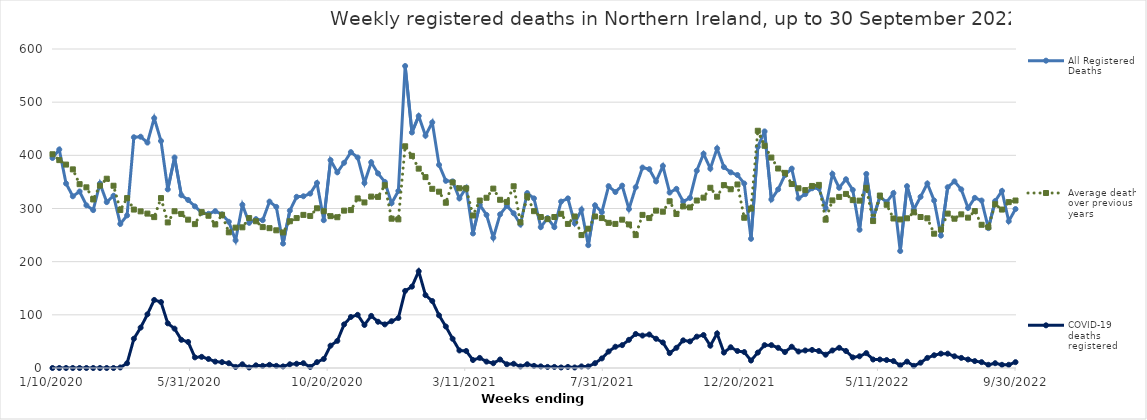
| Category | All Registered Deaths | Average deaths over previous 5 years | COVID-19 deaths registered |
|---|---|---|---|
| 1/10/20 | 395 | 402 | 0 |
| 1/17/20 | 411 | 391 | 0 |
| 1/24/20 | 347 | 382.6 | 0 |
| 1/31/20 | 323 | 373.6 | 0 |
| 2/7/20 | 332 | 345.8 | 0 |
| 2/14/20 | 306 | 339.8 | 0 |
| 2/21/20 | 297 | 317 | 0 |
| 2/28/20 | 347 | 343 | 0 |
| 3/6/20 | 312 | 356 | 0 |
| 3/13/20 | 324 | 342.8 | 0 |
| 3/20/20 | 271 | 297.2 | 1 |
| 3/27/20 | 287 | 319.6 | 9 |
| 4/3/20 | 434 | 298 | 55 |
| 4/10/20 | 435 | 294.6 | 76 |
| 4/17/20 | 424 | 290.4 | 101 |
| 4/24/20 | 470 | 283.8 | 128 |
| 5/1/20 | 427 | 319.6 | 124 |
| 5/8/20 | 336 | 273.8 | 84 |
| 5/15/20 | 396 | 294.8 | 74 |
| 5/22/20 | 325 | 289.8 | 53 |
| 5/29/20 | 316 | 279 | 49 |
| 6/5/20 | 304 | 270.6 | 20 |
| 6/12/20 | 292 | 293.2 | 21 |
| 6/19/20 | 290 | 286.4 | 17 |
| 6/26/20 | 295 | 270 | 12 |
| 7/3/20 | 289 | 288.2 | 11 |
| 7/10/20 | 275 | 255.2 | 9 |
| 7/17/20 | 240 | 264 | 2 |
| 7/24/20 | 307 | 264.6 | 7 |
| 7/31/20 | 273 | 282 | 1 |
| 8/7/20 | 280 | 276 | 5 |
| 8/14/20 | 278 | 265 | 4 |
| 8/21/20 | 313 | 263 | 6 |
| 8/28/20 | 303 | 259 | 4 |
| 9/4/20 | 234 | 255 | 3 |
| 9/11/20 | 296 | 276 | 7 |
| 9/18/20 | 322 | 282 | 8 |
| 9/25/20 | 323 | 288 | 9 |
| 10/2/20 | 328 | 286 | 2 |
| 10/9/20 | 348 | 300.4 | 11 |
| 10/16/20 | 278 | 294.8 | 17 |
| 10/23/20 | 391 | 285.6 | 42 |
| 10/30/20 | 368 | 283.6 | 51 |
| 11/6/20 | 386 | 296 | 82 |
| 11/13/20 | 406 | 297 | 96 |
| 11/20/20 | 396 | 319 | 100 |
| 11/27/20 | 348 | 311.4 | 81 |
| 12/4/20 | 387 | 322.4 | 98 |
| 12/11/20 | 366 | 321.8 | 87 |
| 12/18/20 | 350 | 343.8 | 82 |
| 12/25/20 | 310 | 280.8 | 88 |
| 1/1/21 | 333 | 279.6 | 94 |
| 1/8/21 | 568 | 417 | 145 |
| 1/15/21 | 443 | 399 | 153 |
| 1/22/21 | 474 | 375 | 182 |
| 1/29/21 | 437 | 359 | 137 |
| 2/5/21 | 462 | 337 | 126 |
| 2/12/21 | 382 | 331.6 | 99 |
| 2/19/21 | 352 | 310.8 | 78 |
| 2/26/21 | 351 | 349 | 55 |
| 3/5/21 | 319 | 338 | 33 |
| 3/12/21 | 339 | 338 | 32 |
| 3/19/21 | 253 | 286.8 | 15 |
| 3/26/21 | 307 | 315 | 19 |
| 4/2/21 | 288 | 320.2 | 12 |
| 4/9/21 | 245 | 337.4 | 9 |
| 4/16/21 | 289 | 316.4 | 16 |
| 4/23/21 | 305 | 312.4 | 7 |
| 4/30/21 | 291 | 341.8 | 8 |
| 5/7/21 | 270 | 274 | 3 |
| 5/14/21 | 329 | 323 | 7 |
| 5/21/21 | 319 | 295 | 4 |
| 5/28/21 | 265 | 284 | 3 |
| 6/4/21 | 282 | 280 | 2 |
| 6/11/21 | 265 | 284 | 2 |
| 6/18/21 | 313 | 290 | 1 |
| 6/25/21 | 319 | 271 | 2 |
| 7/2/21 | 272 | 285 | 1 |
| 7/9/21 | 298 | 250 | 3 |
| 7/16/21 | 231 | 262 | 3 |
| 7/23/21 | 306 | 285 | 9 |
| 7/30/21 | 293 | 282 | 18 |
| 8/6/21 | 342 | 273 | 31 |
| 8/13/21 | 331 | 271 | 40 |
| 8/20/21 | 343 | 279 | 43 |
| 8/27/21 | 299 | 270 | 53 |
| 9/3/21 | 340 | 250 | 64 |
| 9/10/21 | 377 | 288 | 61 |
| 9/17/21 | 374 | 282 | 63 |
| 9/24/21 | 351 | 296 | 55 |
| 10/1/21 | 380 | 294 | 48 |
| 10/8/21 | 330 | 313.6 | 28 |
| 10/15/21 | 337 | 289.6 | 38 |
| 10/22/21 | 313 | 304 | 52 |
| 10/29/21 | 320 | 302 | 50 |
| 11/5/21 | 371 | 315 | 59 |
| 11/12/21 | 403 | 320.4 | 62 |
| 11/19/21 | 375 | 339 | 42 |
| 11/26/21 | 413 | 322.2 | 65 |
| 12/3/21 | 378 | 344 | 29 |
| 12/10/21 | 368 | 336.2 | 39 |
| 12/17/21 | 363 | 345.2 | 32 |
| 12/24/21 | 347 | 282.6 | 30 |
| 12/31/21 | 243 | 299.8 | 14 |
| 1/7/22 | 416 | 446.2 | 29 |
| 1/14/22 | 445 | 418 | 43 |
| 1/21/22 | 317 | 395.8 | 43 |
| 1/28/22 | 336 | 375.2 | 38 |
| 2/4/22 | 363 | 367 | 30 |
| 2/11/22 | 375 | 346 | 40 |
| 2/18/22 | 319 | 338 | 31 |
| 2/25/22 | 327 | 334.6 | 33 |
| 3/4/22 | 338 | 342.4 | 34 |
| 3/11/22 | 338 | 344.4 | 32 |
| 3/18/22 | 301 | 279 | 25 |
| 3/25/22 | 365 | 315.2 | 33 |
| 4/1/22 | 339 | 321.8 | 38 |
| 4/8/22 | 355 | 327.4 | 32 |
| 4/15/22 | 335 | 315.8 | 20 |
| 4/22/22 | 260 | 314.8 | 22 |
| 4/29/22 | 365 | 338.8 | 28 |
| 5/6/22 | 281 | 276.4 | 16 |
| 5/13/22 | 322 | 324.4 | 16 |
| 5/20/22 | 312 | 307 | 15 |
| 5/27/22 | 329 | 281.2 | 13 |
| 6/3/22 | 220 | 279.4 | 5 |
| 6/10/22 | 342 | 281.6 | 12 |
| 6/17/22 | 298 | 292.8 | 4 |
| 6/24/22 | 322 | 284 | 10 |
| 7/1/22 | 347 | 281.6 | 19 |
| 7/8/22 | 315 | 252.6 | 24 |
| 7/15/22 | 249 | 260.4 | 27 |
| 7/22/22 | 340 | 290.4 | 27 |
| 7/29/22 | 351 | 280.8 | 22 |
| 8/5/22 | 336 | 289 | 19 |
| 8/12/22 | 301 | 282.8 | 16 |
| 8/19/22 | 320 | 295.2 | 13 |
| 8/26/22 | 315 | 269.4 | 11 |
| 9/2/22 | 263 | 265 | 6 |
| 9/9/22 | 314 | 308 | 9 |
| 9/16/22 | 333 | 298 | 6 |
| 9/23/22 | 276 | 312 | 6 |
| 9/30/22 | 299 | 315 | 11 |